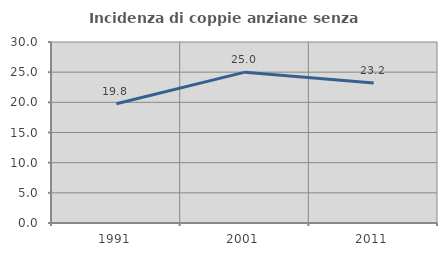
| Category | Incidenza di coppie anziane senza figli  |
|---|---|
| 1991.0 | 19.767 |
| 2001.0 | 25 |
| 2011.0 | 23.188 |